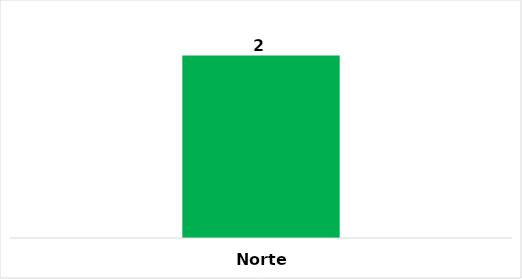
| Category | Total |
|---|---|
| Norte | 2 |